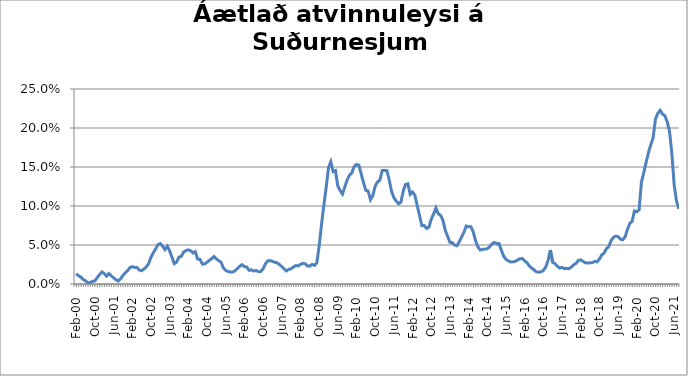
| Category | Series 0 |
|---|---|
| Feb-00 | 0.013 |
| Mar-00 | 0.011 |
| Apr-00 | 0.009 |
| May-00 | 0.006 |
| Jun-00 | 0.004 |
| Jul-00 | 0.002 |
| Aug-00 | 0.002 |
| Sep-00 | 0.003 |
| Oct-00 | 0.004 |
| Nov-00 | 0.008 |
| Dec-00 | 0.012 |
| Jan-01 | 0.015 |
| Feb-01 | 0.013 |
| Mar-01 | 0.01 |
| Apr-01 | 0.013 |
| May-01 | 0.011 |
| Jun-01 | 0.008 |
| Jul-01 | 0.006 |
| Aug-01 | 0.004 |
| Sep-01 | 0.007 |
| Oct-01 | 0.011 |
| Nov-01 | 0.014 |
| Dec-01 | 0.017 |
| Jan-02 | 0.021 |
| Feb-02 | 0.022 |
| Mar-02 | 0.021 |
| Apr-02 | 0.021 |
| May-02 | 0.018 |
| Jun-02 | 0.017 |
| Jul-02 | 0.019 |
| Aug-02 | 0.022 |
| Sep-02 | 0.026 |
| Oct-02 | 0.034 |
| Nov-02 | 0.04 |
| Dec-02 | 0.045 |
| Jan-03 | 0.05 |
| Feb-03 | 0.052 |
| Mar-03 | 0.049 |
| Apr-03 | 0.044 |
| May-03 | 0.049 |
| Jun-03 | 0.043 |
| Jul-03 | 0.034 |
| Aug-03 | 0.026 |
| Sep-03 | 0.028 |
| Oct-03 | 0.034 |
| Nov-03 | 0.035 |
| Dec-03 | 0.041 |
| Jan-04 | 0.043 |
| Feb-04 | 0.044 |
| Mar-04 | 0.043 |
| Apr-04 | 0.04 |
| May-04 | 0.041 |
| Jun-04 | 0.032 |
| Jul-04 | 0.032 |
| Aug-04 | 0.026 |
| Sep-04 | 0.026 |
| Oct-04 | 0.028 |
| Nov-04 | 0.03 |
| Dec-04 | 0.032 |
| Jan-05 | 0.035 |
| Feb-05 | 0.032 |
| Mar-05 | 0.03 |
| Apr-05 | 0.028 |
| May-05 | 0.021 |
| Jun-05 | 0.018 |
| Jul-05 | 0.016 |
| Aug-05 | 0.015 |
| Sep-05 | 0.015 |
| Oct-05 | 0.017 |
| Nov-05 | 0.02 |
| Dec-05 | 0.023 |
| Jan-06 | 0.025 |
| Feb-06 | 0.022 |
| Mar-06 | 0.022 |
| Apr-06 | 0.018 |
| May-06 | 0.018 |
| Jun-06 | 0.017 |
| Jul-06 | 0.017 |
| Aug-06 | 0.016 |
| Sep-06 | 0.016 |
| Oct-06 | 0.019 |
| Nov-06 | 0.026 |
| Dec-06 | 0.03 |
| Jan-07 | 0.03 |
| Feb-07 | 0.029 |
| Mar-07 | 0.028 |
| Apr-07 | 0.027 |
| May-07 | 0.025 |
| Jun-07 | 0.022 |
| Jul-07 | 0.019 |
| Aug-07 | 0.017 |
| Sep-07 | 0.019 |
| Oct-07 | 0.02 |
| Nov-07 | 0.022 |
| Dec-07 | 0.024 |
| Jan-08 | 0.023 |
| Feb-08 | 0.025 |
| Mar-08 | 0.026 |
| Apr-08 | 0.026 |
| May-08 | 0.023 |
| Jun-08 | 0.023 |
| Jul-08 | 0.025 |
| Aug-08 | 0.024 |
| Sep-08 | 0.027 |
| Oct-08 | 0.048 |
| Nov-08 | 0.075 |
| Dec-08 | 0.1 |
| Jan-09 | 0.123 |
| Feb-09 | 0.149 |
| Mar-09 | 0.157 |
| Apr-09 | 0.144 |
| May-09 | 0.145 |
| Jun-09 | 0.126 |
| Jul-09 | 0.12 |
| Aug-09 | 0.115 |
| Sep-09 | 0.124 |
| Oct-09 | 0.133 |
| Nov-09 | 0.139 |
| Dec-09 | 0.142 |
| Jan-10 | 0.151 |
| Feb-10 | 0.153 |
| Mar-10 | 0.152 |
| Apr-10 | 0.141 |
| May-10 | 0.13 |
| Jun-10 | 0.12 |
| Jul-10 | 0.119 |
| Aug-10 | 0.108 |
| Sep-10 | 0.114 |
| Oct-10 | 0.125 |
| Nov-10 | 0.131 |
| Dec-10 | 0.133 |
| Jan-11 | 0.145 |
| Feb-11 | 0.146 |
| Mar-11 | 0.145 |
| Apr-11 | 0.134 |
| May-11 | 0.119 |
| Jun-11 | 0.111 |
| Jul-11 | 0.106 |
| Aug-11 | 0.103 |
| Sep-11 | 0.105 |
| Oct-11 | 0.119 |
| Nov-11 | 0.128 |
| Dec-11 | 0.128 |
| Jan-12 | 0.115 |
| Feb-12 | 0.118 |
| Mar-12 | 0.114 |
| Apr-12 | 0.101 |
| May-12 | 0.088 |
| Jun-12 | 0.075 |
| Jul-12 | 0.075 |
| Aug-12 | 0.071 |
| Sep-12 | 0.073 |
| Oct-12 | 0.083 |
| Nov-12 | 0.09 |
| Dec-12 | 0.098 |
| Jan-13 | 0.09 |
| Feb-13 | 0.088 |
| Mar-13 | 0.082 |
| Apr-13 | 0.069 |
| May-13 | 0.061 |
| Jun-13 | 0.053 |
| Jul-13 | 0.053 |
| Aug-13 | 0.05 |
| Sep-13 | 0.049 |
| Oct-13 | 0.054 |
| Nov-13 | 0.06 |
| Dec-13 | 0.066 |
| Jan-14 | 0.074 |
| Feb-14 | 0.073 |
| Mar-14 | 0.073 |
| Apr-14 | 0.067 |
| May-14 | 0.055 |
| Jun-14 | 0.048 |
| Jul-14 | 0.044 |
| Aug-14 | 0.044 |
| Sep-14 | 0.045 |
| Oct-14 | 0.045 |
| nóv.14*** | 0.048 |
| Dec-14 | 0.051 |
| Jan-15 | 0.053 |
| Feb-15 | 0.052 |
| Mar-15 | 0.052 |
| Apr-15 | 0.044 |
| May-15 | 0.036 |
| Jun-15 | 0.032 |
| Jul-15 | 0.03 |
| Aug-15 | 0.028 |
| Sep-15 | 0.028 |
| Oct-15 | 0.029 |
| Nov-15 | 0.031 |
| Dec-15 | 0.032 |
| Jan-16 | 0.033 |
| Feb-16 | 0.03 |
| Mar-16 | 0.027 |
| Apr-16 | 0.023 |
| May-16 | 0.02 |
| Jun-16 | 0.018 |
| Jul-16 | 0.015 |
| Aug-16 | 0.015 |
| Sep-16 | 0.016 |
| Oct-16 | 0.017 |
| Nov-16 | 0.022 |
| Dec-16 | 0.03 |
| Jan-17 | 0.044 |
| Feb-17 | 0.028 |
| Mar-17 | 0.026 |
| Apr-17 | 0.023 |
| May-17 | 0.02 |
| Jun-17 | 0.021 |
| Jul-17 | 0.02 |
| Aug-17 | 0.02 |
| Sep-17 | 0.02 |
| Oct-17 | 0.022 |
| Nov-17 | 0.025 |
| Dec-17 | 0.026 |
| Jan-18 | 0.03 |
| Feb-18 | 0.031 |
| Mar-18 | 0.029 |
| Apr-18 | 0.027 |
| May-18 | 0.027 |
| Jun-18 | 0.027 |
| Jul-18 | 0.027 |
| Aug-18 | 0.029 |
| Sep-18 | 0.028 |
| Oct-18 | 0.032 |
| Nov-18 | 0.037 |
| Dec-18 | 0.039 |
| Jan-19 | 0.045 |
| Feb-19 | 0.048 |
| Mar-19 | 0.056 |
| Apr-19 | 0.06 |
| May-19 | 0.061 |
| Jun-19 | 0.061 |
| Jul-19 | 0.057 |
| Aug-19 | 0.057 |
| Sep-19 | 0.06 |
| Oct-19 | 0.07 |
| Nov-19 | 0.078 |
| Dec-19 | 0.08 |
| Jan-20 | 0.094 |
| Feb-20 | 0.093 |
| mars 2020* | 0.095 |
| Apr-20 | 0.131 |
| May-20 | 0.143 |
| Jun-20 | 0.156 |
| Jul-20 | 0.169 |
| Aug-20 | 0.178 |
| Sep-20 | 0.188 |
| Oct-20 | 0.212 |
| Nov-20 | 0.219 |
| Dec-20 | 0.223 |
| Jan-21 | 0.218 |
| Feb-21 | 0.216 |
| Mar-21 | 0.208 |
| Apr-21 | 0.196 |
| May-21 | 0.168 |
| Jun-21 | 0.127 |
| Jul-21 | 0.107 |
| Aug-21 | 0.096 |